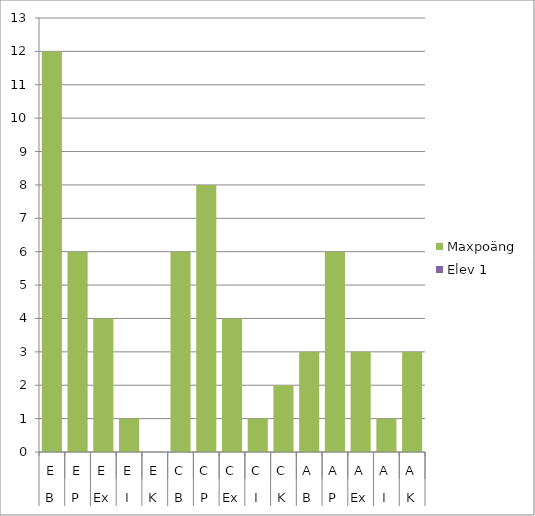
| Category | Maxpoäng | Elev 1 |
|---|---|---|
| 0 | 12 | 0 |
| 1 | 6 | 0 |
| 2 | 4 | 0 |
| 3 | 1 | 0 |
| 4 | 0 | 0 |
| 5 | 6 | 0 |
| 6 | 8 | 0 |
| 7 | 4 | 0 |
| 8 | 1 | 0 |
| 9 | 2 | 0 |
| 10 | 3 | 0 |
| 11 | 6 | 0 |
| 12 | 3 | 0 |
| 13 | 1 | 0 |
| 14 | 3 | 0 |